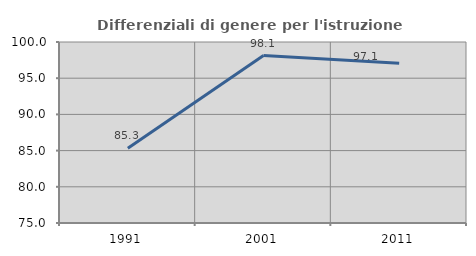
| Category | Differenziali di genere per l'istruzione superiore |
|---|---|
| 1991.0 | 85.323 |
| 2001.0 | 98.129 |
| 2011.0 | 97.08 |